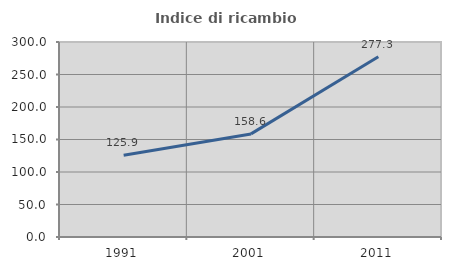
| Category | Indice di ricambio occupazionale  |
|---|---|
| 1991.0 | 125.926 |
| 2001.0 | 158.621 |
| 2011.0 | 277.273 |